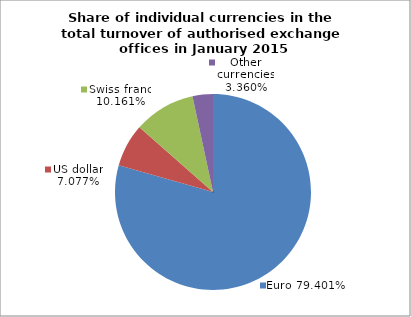
| Category | EUR |
|---|---|
| 0 | 0.794 |
| 1 | 0.071 |
| 2 | 0.102 |
| 3 | 0.034 |